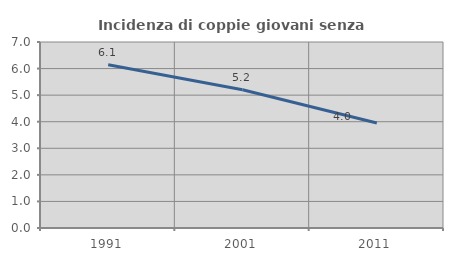
| Category | Incidenza di coppie giovani senza figli |
|---|---|
| 1991.0 | 6.143 |
| 2001.0 | 5.201 |
| 2011.0 | 3.951 |